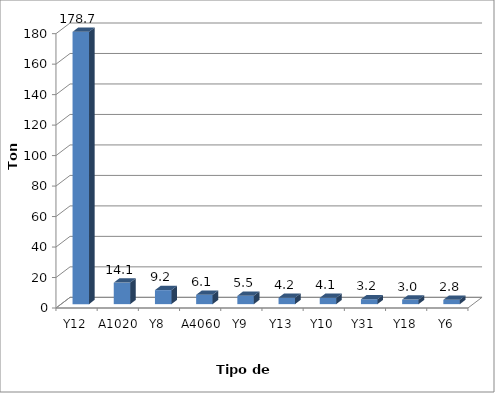
| Category | Series 0 |
|---|---|
| Y12 | 178.666 |
| A1020 | 14.122 |
| Y8 | 9.194 |
| A4060 | 6.13 |
| Y9 | 5.466 |
| Y13 | 4.22 |
| Y10 | 4.133 |
| Y31 | 3.204 |
| Y18 | 2.972 |
| Y6 | 2.848 |